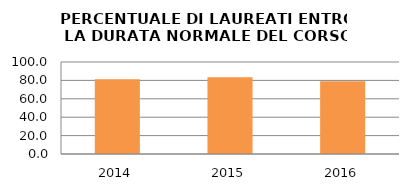
| Category | 2014 2015 2016 |
|---|---|
| 2014.0 | 81.25 |
| 2015.0 | 83.333 |
| 2016.0 | 78.947 |